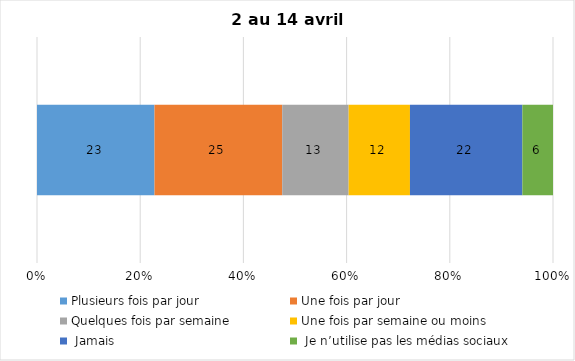
| Category | Plusieurs fois par jour | Une fois par jour | Quelques fois par semaine   | Une fois par semaine ou moins   |  Jamais   |  Je n’utilise pas les médias sociaux |
|---|---|---|---|---|---|---|
| 0 | 23 | 25 | 13 | 12 | 22 | 6 |